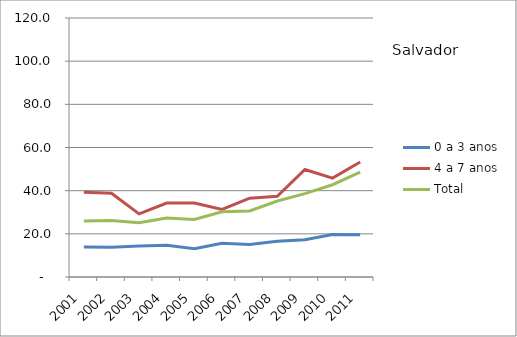
| Category | 0 a 3 anos | 4 a 7 anos | Total |
|---|---|---|---|
| 2001.0 | 13.94 | 39.3 | 25.94 |
| 2002.0 | 13.79 | 38.76 | 26.13 |
| 2003.0 | 14.31 | 29.24 | 25.11 |
| 2004.0 | 14.74 | 34.23 | 27.32 |
| 2005.0 | 13.08 | 34.27 | 26.67 |
| 2006.0 | 15.58 | 31.3 | 30.21 |
| 2007.0 | 15.01 | 36.5 | 30.62 |
| 2008.0 | 16.58 | 37.39 | 35.22 |
| 2009.0 | 17.29 | 49.79 | 38.65 |
| 2010.0 | 19.64 | 45.83 | 42.75 |
| 2011.0 | 19.52 | 53.31 | 48.62 |